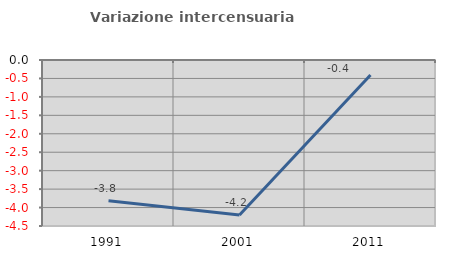
| Category | Variazione intercensuaria annua |
|---|---|
| 1991.0 | -3.818 |
| 2001.0 | -4.201 |
| 2011.0 | -0.408 |